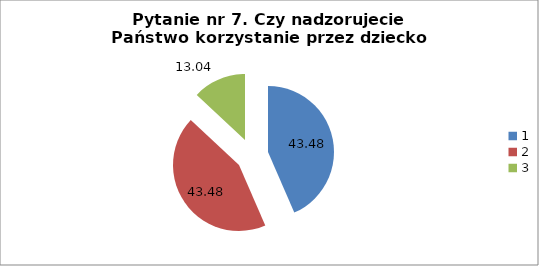
| Category | % |
|---|---|
| 0 | 43.478 |
| 1 | 43.478 |
| 2 | 13.043 |